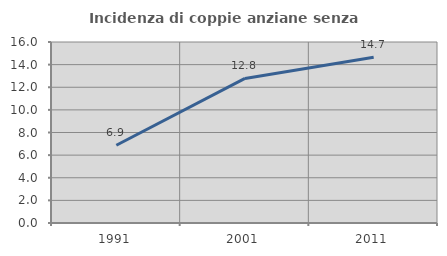
| Category | Incidenza di coppie anziane senza figli  |
|---|---|
| 1991.0 | 6.873 |
| 2001.0 | 12.78 |
| 2011.0 | 14.658 |